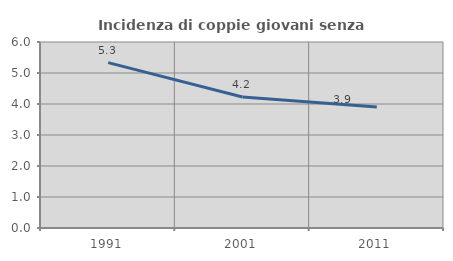
| Category | Incidenza di coppie giovani senza figli |
|---|---|
| 1991.0 | 5.333 |
| 2001.0 | 4.225 |
| 2011.0 | 3.906 |